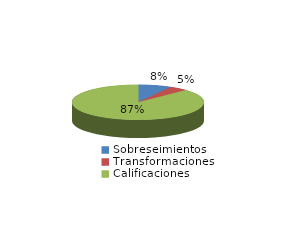
| Category | Series 0 |
|---|---|
| Sobreseimientos | 63 |
| Transformaciones | 35 |
| Calificaciones | 679 |